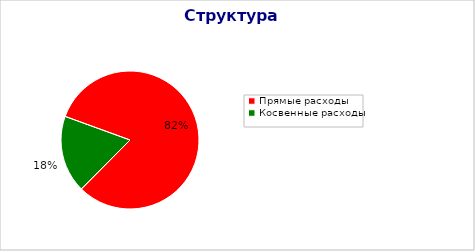
| Category | Series 0 |
|---|---|
| Прямые расходы | 26079835590.931 |
| Косвенные расходы | 5772322274.538 |